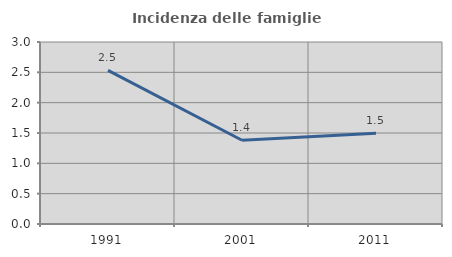
| Category | Incidenza delle famiglie numerose |
|---|---|
| 1991.0 | 2.531 |
| 2001.0 | 1.381 |
| 2011.0 | 1.497 |